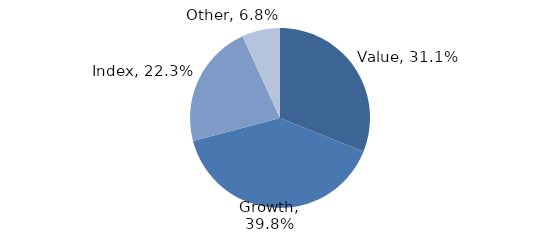
| Category | Investment Style |
|---|---|
| Value | 0.311 |
| Growth | 0.398 |
| Index | 0.223 |
| Other | 0.068 |